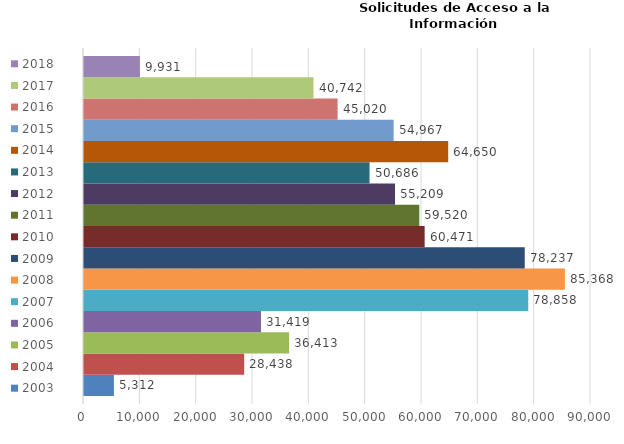
| Category | 2003 | 2004 | 2005 | 2006 | 2007 | 2008 | 2009 | 2010 | 2011 | 2012 | 2013 | 2014 | 2015 | 2016 | 2017 | 2018 |
|---|---|---|---|---|---|---|---|---|---|---|---|---|---|---|---|---|
| 0 | 5312 | 28438 | 36413 | 31419 | 78858 | 85368 | 78237 | 60471 | 59520 | 55209 | 50686 | 64650 | 54967 | 45020 | 40742 | 9931 |